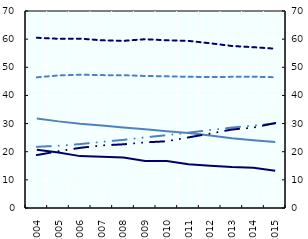
| Category |   Less than upper secondary education, |   Upper secondary education, |   Tertiary education, |
|---|---|---|---|
| 2004.0 | 20.692 | 60.492 | 21.739 |
| 2005.0 | 19.702 | 60.129 | 22.122 |
| 2006.0 | 18.434 | 60.182 | 22.711 |
| 2007.0 | 18.186 | 59.59 | 23.505 |
| 2008.0 | 17.959 | 59.404 | 24.208 |
| 2009.0 | 16.712 | 59.971 | 25.106 |
| 2010.0 | 16.693 | 59.594 | 25.889 |
| 2011.0 | 15.526 | 59.384 | 26.769 |
| 2012.0 | 15.026 | 58.533 | 27.701 |
| 2013.0 | 14.547 | 57.573 | 28.578 |
| 2014.0 | 14.283 | 57.133 | 29.27 |
| 2015.0 | 13.212 | 56.614 | 30.062 |